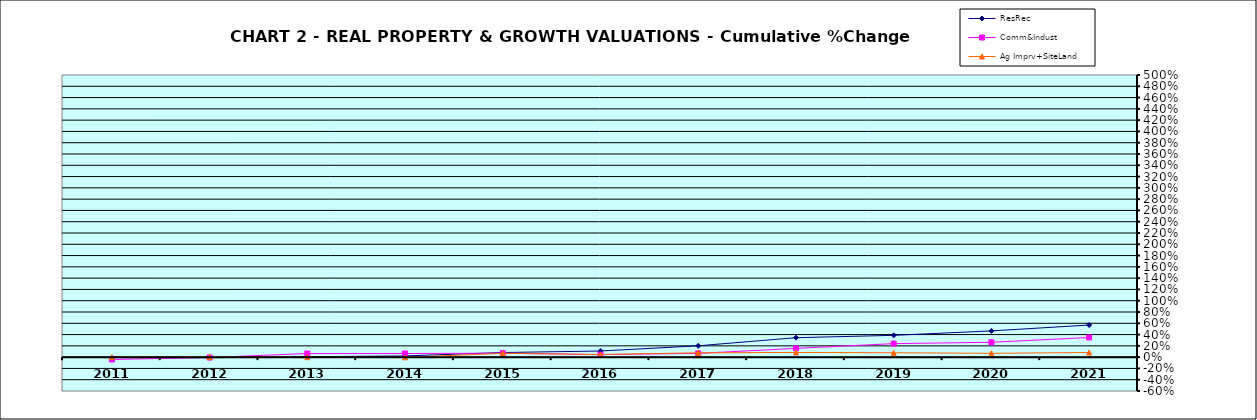
| Category | ResRec | Comm&Indust | Ag Imprv+SiteLand |
|---|---|---|---|
| 2011.0 | -0.008 | -0.042 | 0 |
| 2012.0 | -0.01 | -0.006 | 0.003 |
| 2013.0 | 0.008 | 0.064 | 0 |
| 2014.0 | 0.022 | 0.064 | -0.003 |
| 2015.0 | 0.082 | 0.07 | 0.067 |
| 2016.0 | 0.109 | 0.044 | 0.047 |
| 2017.0 | 0.201 | 0.067 | 0.077 |
| 2018.0 | 0.345 | 0.155 | 0.083 |
| 2019.0 | 0.386 | 0.24 | 0.078 |
| 2020.0 | 0.465 | 0.263 | 0.068 |
| 2021.0 | 0.569 | 0.348 | 0.083 |